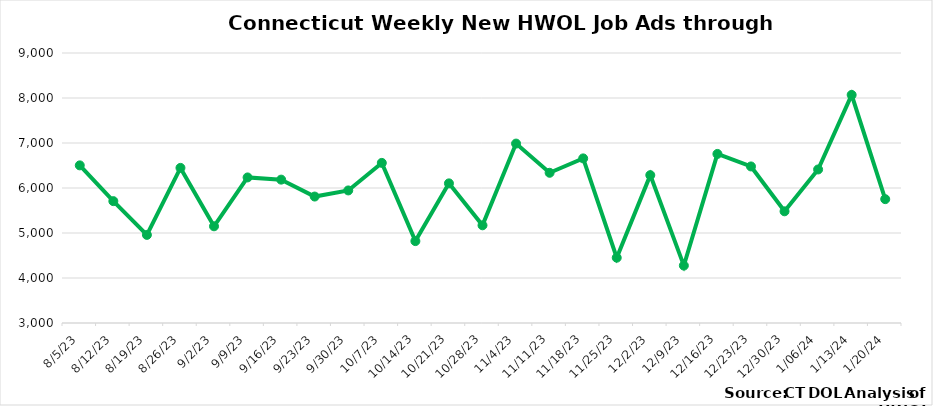
| Category | Connecticut |
|---|---|
| 8/5/23 | 6503 |
| 8/12/23 | 5708 |
| 8/19/23 | 4958 |
| 8/26/23 | 6447 |
| 9/2/23 | 5149 |
| 9/9/23 | 6235 |
| 9/16/23 | 6186 |
| 9/23/23 | 5810 |
| 9/30/23 | 5946 |
| 10/7/23 | 6558 |
| 10/14/23 | 4820 |
| 10/21/23 | 6103 |
| 10/28/23 | 5171 |
| 11/4/23 | 6987 |
| 11/11/23 | 6338 |
| 11/18/23 | 6658 |
| 11/25/23 | 4451 |
| 12/2/23 | 6286 |
| 12/9/23 | 4276 |
| 12/16/23 | 6757 |
|  12/23/23 | 6479 |
|  12/30/23 | 5482 |
|  1/06/24 | 6412 |
|  1/13/24 | 8069 |
|  1/20/24 | 5752 |